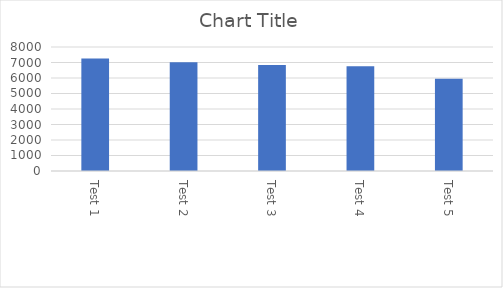
| Category | Series 0 |
|---|---|
| Test 1 | 7261 |
| Test 2 | 7009 |
| Test 3 | 6843 |
| Test 4 | 6754 |
| Test 5 | 5944 |